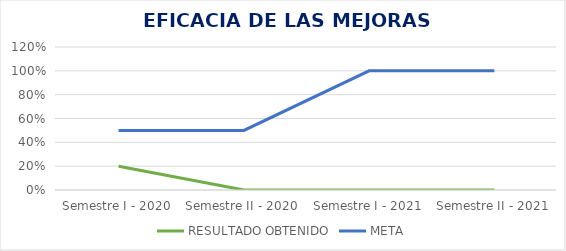
| Category | RESULTADO OBTENIDO | META |
|---|---|---|
| Semestre I - 2020 | 0.2 | 0.5 |
| Semestre II - 2020 | 0 | 0.5 |
| Semestre I - 2021 | 0 | 1 |
| Semestre II - 2021 | 0 | 1 |